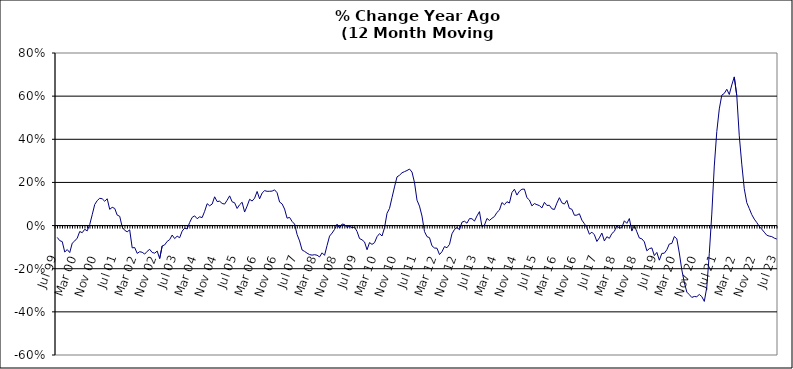
| Category | Series 0 |
|---|---|
| Jul 99 | -0.055 |
| Aug 99 | -0.07 |
| Sep 99 | -0.074 |
| Oct 99 | -0.123 |
| Nov 99 | -0.111 |
| Dec 99 | -0.125 |
| Jan 00 | -0.082 |
| Feb 00 | -0.071 |
| Mar 00 | -0.058 |
| Apr 00 | -0.027 |
| May 00 | -0.033 |
| Jun 00 | -0.017 |
| Jul 00 | -0.025 |
| Aug 00 | 0.005 |
| Sep 00 | 0.05 |
| Oct 00 | 0.098 |
| Nov 00 | 0.116 |
| Dec 00 | 0.127 |
| Jan 01 | 0.124 |
| Feb 01 | 0.113 |
| Mar 01 | 0.124 |
| Apr 01 | 0.075 |
| May 01 | 0.085 |
| Jun 01 | 0.08 |
| Jul 01 | 0.048 |
| Aug 01 | 0.043 |
| Sep 01 | -0.007 |
| Oct 01 | -0.022 |
| Nov 01 | -0.029 |
| Dec 01 | -0.02 |
| Jan 02 | -0.103 |
| Feb 02 | -0.102 |
| Mar 02 | -0.129 |
| Apr 02 | -0.121 |
| May 02 | -0.124 |
| Jun 02 | -0.132 |
| Jul 02 | -0.119 |
| Aug 02 | -0.11 |
| Sep 02 | -0.125 |
| Oct 02 | -0.128 |
| Nov 02 | -0.118 |
| Dec 02 | -0.153 |
| Jan 03 | -0.094 |
| Feb 03 | -0.09 |
| Mar 03 | -0.073 |
| Apr 03 | -0.065 |
| May 03 | -0.044 |
| Jun 03 | -0.06 |
| Jul 03 | -0.049 |
| Aug 03 | -0.056 |
| Sep 03 | -0.026 |
| Oct 03 | -0.012 |
| Nov 03 | -0.016 |
| Dec 03 | 0.014 |
| Jan 04 | 0.038 |
| Feb 04 | 0.045 |
| Mar 04 | 0.032 |
| Apr 04 | 0.041 |
| May 04 | 0.037 |
| Jun 04 | 0.066 |
| Jul 04 | 0.101 |
| Aug 04 | 0.092 |
| Sep 04 | 0.1 |
| Oct 04 | 0.133 |
| Nov 04 | 0.111 |
| Dec 04 | 0.113 |
| Jan 05 | 0.103 |
| Feb 05 | 0.1 |
| Mar 05 | 0.118 |
| Apr 05 | 0.138 |
| May 05 | 0.11 |
| Jun 05 | 0.106 |
| Jul 05 | 0.079 |
| Aug 05 | 0.097 |
| Sep 05 | 0.108 |
| Oct 05 | 0.063 |
| Nov 05 | 0.09 |
| Dec 05 | 0.122 |
| Jan 06 | 0.114 |
| Feb 06 | 0.127 |
| Mar 06 | 0.158 |
| Apr 06 | 0.124 |
| May 06 | 0.151 |
| Jun 06 | 0.162 |
| Jul 06 | 0.159 |
| Aug 06 | 0.159 |
| Sep 06 | 0.16 |
| Oct 06 | 0.166 |
| Nov 06 | 0.152 |
| Dec 06 | 0.109 |
| Jan 07 | 0.101 |
| Feb 07 | 0.076 |
| Mar 07 | 0.034 |
| Apr 07 | 0.038 |
| May 07 | 0.019 |
| Jun 07 | 0.007 |
| Jul 07 | -0.041 |
| Aug 07 | -0.071 |
| Sep 07 | -0.113 |
| Oct 07 | -0.12 |
| Nov 07 | -0.128 |
| Dec 07 | -0.135 |
| Jan 08 | -0.137 |
| Feb 08 | -0.135 |
| Mar 08 | -0.137 |
| Apr 08 | -0.145 |
| May 08 | -0.126 |
| Jun 08 | -0.138 |
| Jul 08 | -0.093 |
| Aug 08 | -0.049 |
| Sep-08 | -0.035 |
| Oct 08 | -0.018 |
| Nov 08 | 0.007 |
| Dec 08 | -0.011 |
| Jan 09 | 0.007 |
| Feb 09 | 0.005 |
| Mar 09 | -0.009 |
| Apr 09 | -0.003 |
| May 09 | -0.01 |
| Jun 09 | -0.007 |
| Jul 09 | -0.027 |
| Aug 09 | -0.06 |
| Sep 09 | -0.066 |
| Oct 09 | -0.076 |
| Nov 09 | -0.112 |
| Dec 09 | -0.079 |
| Jan 10 | -0.087 |
| Feb 10 | -0.079 |
| Mar 10 | -0.052 |
| Apr 10 | -0.037 |
| May 10 | -0.048 |
| Jun 10 | -0.01 |
| Jul 10 | 0.057 |
| Aug 10 | 0.08 |
| Sep 10 | 0.13 |
| Oct 10 | 0.179 |
| Nov 10 | 0.226 |
| Dec 10 | 0.233 |
| Jan 11 | 0.245 |
| Feb 11 | 0.25 |
| Mar 11 | 0.255 |
| Apr 11 | 0.262 |
| May 11 | 0.248 |
| Jun 11 | 0.199 |
| Jul 11 | 0.118 |
| Aug 11 | 0.09 |
| Sep 11 | 0.044 |
| Oct 11 | -0.028 |
| Nov 11 | -0.051 |
| Dec 11 | -0.056 |
| Jan 12 | -0.094 |
| Feb 12 | -0.104 |
| Mar 12 | -0.105 |
| Apr 12 | -0.134 |
| May 12 | -0.121 |
| Jun 12 | -0.098 |
| Jul 12 | -0.103 |
| Aug 12 | -0.087 |
| Sep 12 | -0.038 |
| Oct 12 | -0.018 |
| Nov 12 | -0.009 |
| Dec 12 | -0.019 |
| Jan 13 | 0.016 |
| Feb-13 | 0.02 |
| Mar-13 | 0.011 |
| Apr 13 | 0.032 |
| May 13 | 0.032 |
| Jun-13 | 0.021 |
| Jul 13 | 0.045 |
| Aug 13 | 0.065 |
| Sep 13 | -0.005 |
| Oct 13 | 0.002 |
| Nov 13 | 0.033 |
| Dec 13 | 0.024 |
| Jan 14 | 0.034 |
| Feb-14 | 0.042 |
| Mar 14 | 0.061 |
| Apr 14 | 0.072 |
| May 14 | 0.107 |
| Jun 14 | 0.097 |
| Jul-14 | 0.111 |
| Aug-14 | 0.105 |
| Sep 14 | 0.153 |
| Oct 14 | 0.169 |
| Nov 14 | 0.141 |
| Dec 14 | 0.159 |
| Jan 15 | 0.169 |
| Feb 15 | 0.169 |
| Mar 15 | 0.129 |
| Apr-15 | 0.118 |
| May 15 | 0.091 |
| Jun-15 | 0.102 |
| Jul 15 | 0.097 |
| Aug 15 | 0.092 |
| Sep 15 | 0.082 |
| Oct 15 | 0.108 |
| Nov 15 | 0.093 |
| Dec 15 | 0.094 |
| Jan 16 | 0.078 |
| Feb 16 | 0.075 |
| Mar 16 | 0.104 |
| Apr 16 | 0.129 |
| May 16 | 0.105 |
| Jun 16 | 0.1 |
| Jul 16 | 0.117 |
| Aug 16 | 0.08 |
| Sep 16 | 0.076 |
| Oct 16 | 0.048 |
| Nov 16 | 0.048 |
| Dec 16 | 0.055 |
| Jan 17 | 0.025 |
| Feb 17 | 0.009 |
| Mar 17 | -0.01 |
| Apr 17 | -0.04 |
| May 17 | -0.031 |
| Jun 17 | -0.042 |
| Jul 17 | -0.074 |
| Aug 17 | -0.057 |
| Sep 17 | -0.035 |
| Oct 17 | -0.071 |
| Nov 17 | -0.052 |
| Dec 17 | -0.059 |
| Jan 18 | -0.037 |
| Feb 18 | -0.027 |
| Mar 18 | 0 |
| Apr 18 | -0.012 |
| May 18 | -0.009 |
| Jun 18 | 0.022 |
| Jul 18 | 0.01 |
| Aug 18 | 0.033 |
| Sep 18 | -0.025 |
| Oct 18 | 0.002 |
| Nov 18 | -0.029 |
| Dec 18 | -0.058 |
| Jan 19 | -0.061 |
| Feb 19 | -0.075 |
| Mar 19 | -0.117 |
| Apr 19 | -0.107 |
| May 19 | -0.104 |
| Jun 19 | -0.139 |
| Jul 19 | -0.124 |
| Aug 19 | -0.16 |
| Sep 19 | -0.129 |
| Oct 19 | -0.128 |
| Nov 19 | -0.112 |
| Dec 19 | -0.085 |
| Jan 20 | -0.083 |
| Feb 20 | -0.051 |
| Mar 20 | -0.061 |
| Apr 20 | -0.127 |
| May 20 | -0.206 |
| Jun 20 | -0.264 |
| Jul 20 | -0.308 |
| Aug 20 | -0.32 |
| Sep 20 | -0.333 |
| Oct 20 | -0.329 |
| Nov 20 | -0.33 |
| Dec 20 | -0.319 |
| Jan 21 | -0.329 |
| Feb 21 | -0.352 |
| Mar 21 | -0.286 |
| Apr 21 | -0.129 |
| May 21 | 0.053 |
| Jun 21 | 0.276 |
| Jul 21 | 0.435 |
| Aug 21 | 0.541 |
| Sep 21 | 0.604 |
| Oct 21 | 0.613 |
| Nov 21 | 0.632 |
| Dec 21 | 0.608 |
| Jan 22 | 0.652 |
| Feb 22 | 0.689 |
| Mar 22 | 0.603 |
| Apr 22 | 0.416 |
| May 22 | 0.285 |
| Jun 22 | 0.171 |
| Jul 22 | 0.106 |
| Aug 22 | 0.079 |
| Sep 22 | 0.051 |
| Oct 22 | 0.03 |
| Nov 22 | 0.014 |
| Dec 22 | -0.004 |
| Jan 23 | -0.017 |
| Feb 23 | -0.031 |
| Mar 23 | -0.045 |
| Apr 23 | -0.049 |
| May 23 | -0.051 |
| Jun 23 | -0.058 |
| Jul 23 | -0.062 |